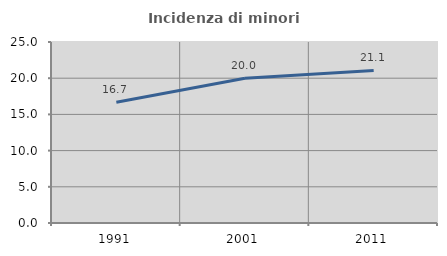
| Category | Incidenza di minori stranieri |
|---|---|
| 1991.0 | 16.667 |
| 2001.0 | 20 |
| 2011.0 | 21.074 |